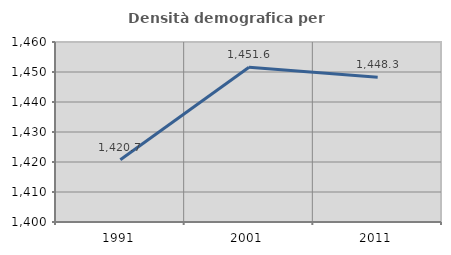
| Category | Densità demografica |
|---|---|
| 1991.0 | 1420.728 |
| 2001.0 | 1451.563 |
| 2011.0 | 1448.257 |